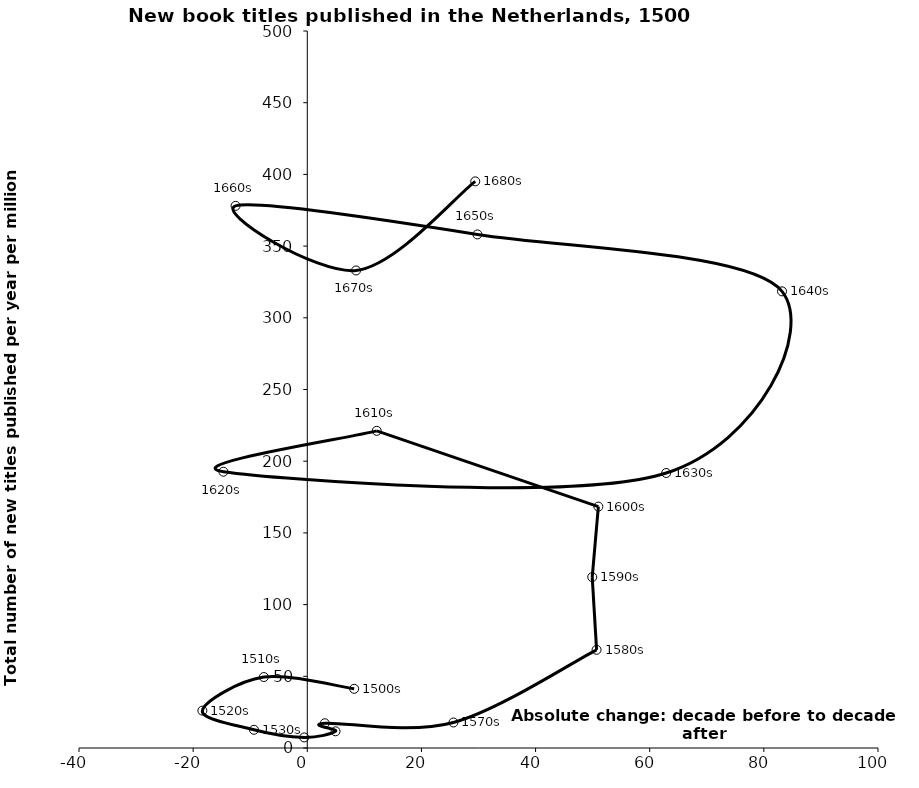
| Category | Series 0 |
|---|---|
| 8.215331015842928 | 41.269 |
| -7.612008674241805 | 49.484 |
| -18.384539426335195 | 26.045 |
| -9.34452897657706 | 12.715 |
| -0.5355602856094146 | 7.356 |
| 4.951572334851407 | 11.644 |
| 3.0718090230353843 | 17.259 |
| 25.60534548022869 | 17.787 |
| 50.68851310429157 | 68.469 |
| 49.926981764456585 | 119.164 |
| 51.00143049853887 | 168.323 |
| 12.170024486541053 | 221.167 |
| -14.694289055092455 | 192.663 |
| 62.892264333642885 | 191.779 |
| 83.18129447402843 | 318.448 |
| 29.801294008659482 | 358.141 |
| -12.56758039411477 | 378.051 |
| 8.544940026045595 | 333.006 |
| 29.429736669743193 | 395.14 |